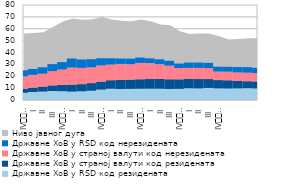
| Category | Државне ХоВ у RSD код резидената | Државне ХоВ у страној валути код резидената | Државне ХоВ у страној валути код нерезидената  | Државне ХоВ у RSD код нерезидената  |
|---|---|---|---|---|
| IV
2013. | 6.108 | 3.154 | 10.712 | 5.01 |
| I | 6.719 | 3.693 | 10.776 | 4.96 |
| II | 7.128 | 4.129 | 10.913 | 5.36 |
| III | 7.559 | 4.715 | 12.058 | 5.877 |
| IV
2014. | 7.422 | 5.345 | 12.945 | 6.191 |
| I | 7.071 | 5.857 | 14.436 | 7.542 |
| II | 7.331 | 6.037 | 13.731 | 6.995 |
| III | 7.823 | 6.394 | 13.34 | 6.803 |
| IV
2015. | 8.819 | 6.564 | 13.761 | 6.033 |
| I | 9.519 | 7.134 | 13.222 | 5.258 |
| II | 9.302 | 7.694 | 13.394 | 4.514 |
| III | 9.367 | 7.777 | 13.058 | 4.627 |
| IV
2016. | 9.497 | 7.979 | 13.754 | 4.506 |
| I | 9.526 | 8.134 | 13.489 | 3.941 |
| II | 9.502 | 8.188 | 12.532 | 4.019 |
| III | 9.291 | 8.165 | 11.493 | 4.069 |
| IV
2017. | 9.396 | 8.007 | 9.507 | 3.763 |
| I | 9.904 | 8.016 | 9.107 | 4.496 |
| II | 9.779 | 7.866 | 9.426 | 4.468 |
| III | 10.161 | 7.473 | 9.279 | 4.388 |
| IV
2018. | 9.812 | 6.953 | 7.23 | 4.052 |
| I | 9.715 | 6.884 | 7.271 | 4.056 |
| II | 9.805 | 6.277 | 7.193 | 4.476 |
| III | 9.944 | 5.871 | 7.217 | 4.626 |
| IV
2019. | 9.735 | 5.913 | 7.019 | 4.409 |